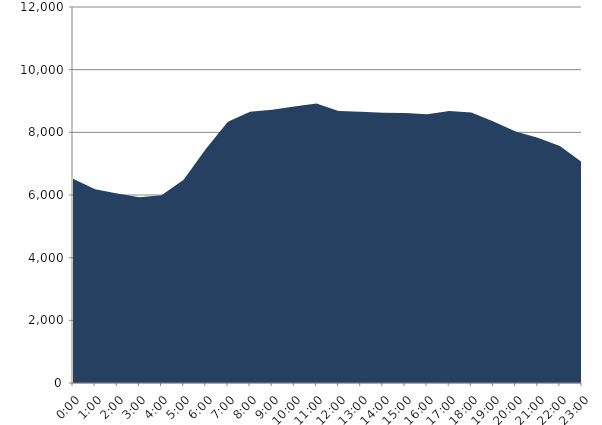
| Category | Series 0 | Series 1 |
|---|---|---|
| 2019-07-17 |  | 6514.78 |
| 2019-07-17 01:00:00 |  | 6186.16 |
| 2019-07-17 02:00:00 |  | 6044.59 |
| 2019-07-17 03:00:00 |  | 5927.19 |
| 2019-07-17 04:00:00 |  | 5993.46 |
| 2019-07-17 05:00:00 |  | 6484.5 |
| 2019-07-17 06:00:00 |  | 7468.45 |
| 2019-07-17 07:00:00 |  | 8334.07 |
| 2019-07-17 08:00:00 |  | 8659.13 |
| 2019-07-17 09:00:00 |  | 8724.24 |
| 2019-07-17 10:00:00 |  | 8826.27 |
| 2019-07-17 11:00:00 |  | 8917.25 |
| 2019-07-17 12:00:00 |  | 8683.58 |
| 2019-07-17 13:00:00 |  | 8656.67 |
| 2019-07-17 14:00:00 |  | 8627.85 |
| 2019-07-17 15:00:00 |  | 8615.8 |
| 2019-07-17 16:00:00 |  | 8580.87 |
| 2019-07-17 17:00:00 |  | 8681.12 |
| 2019-07-17 18:00:00 |  | 8636.4 |
| 2019-07-17 19:00:00 |  | 8349.22 |
| 2019-07-17 20:00:00 |  | 8027.2 |
| 2019-07-17 21:00:00 |  | 7829.19 |
| 2019-07-17 22:00:00 |  | 7566.71 |
| 2019-07-17 23:00:00 |  | 7043.76 |